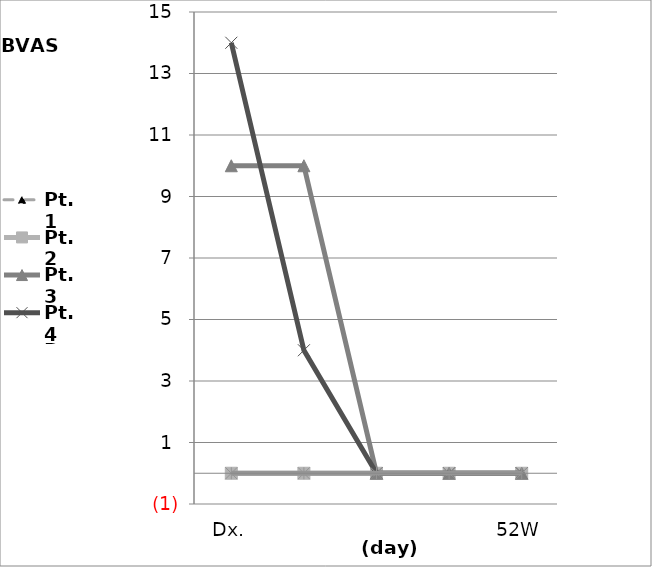
| Category | Pt.1 | Pt.2 | Pt.3 | Pt.4 | Pt.5 |
|---|---|---|---|---|---|
| Dx. | 10 | 0 | 10 | 14 | 0 |
| 0W | 10 | 0 | 10 | 4 | 0 |
| 12W | 0 | 0 | 0 | 0 | 0 |
| 24W | 0.001 | 0 | 0 | 0 | 0 |
| 52W | 0 | 0 | 0 | 0 | 0 |